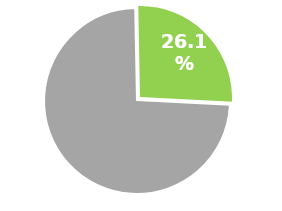
| Category | Series 0 |
|---|---|
| 0 | 0.739 |
| 1 | 0.261 |